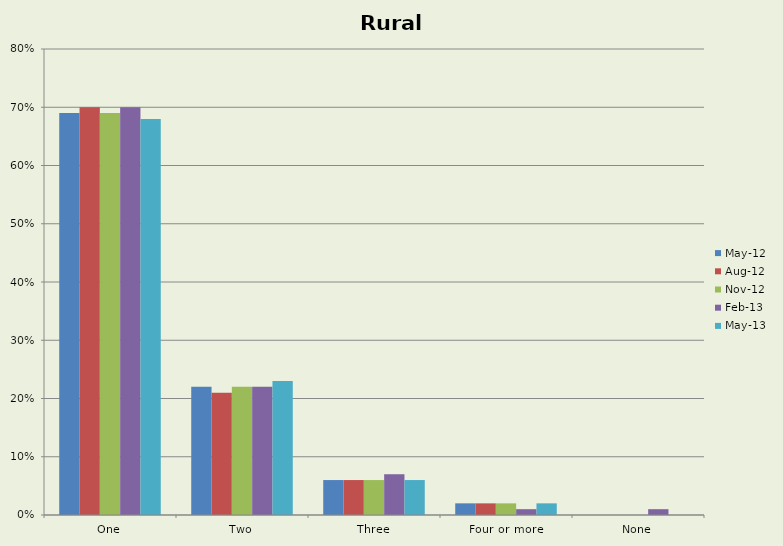
| Category | May-12 | Aug-12 | Nov-12 | Feb-13 | May-13 |
|---|---|---|---|---|---|
| One | 0.69 | 0.7 | 0.69 | 0.7 | 0.68 |
| Two | 0.22 | 0.21 | 0.22 | 0.22 | 0.23 |
| Three | 0.06 | 0.06 | 0.06 | 0.07 | 0.06 |
| Four or more | 0.02 | 0.02 | 0.02 | 0.01 | 0.02 |
| None | 0 | 0 | 0 | 0.01 | 0 |